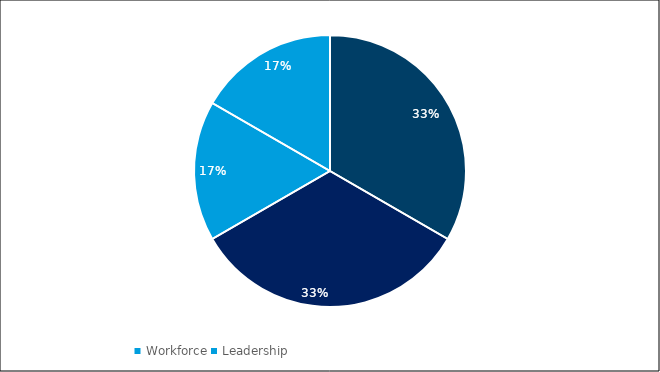
| Category | Votes for "What Focus Area stood out as most important?" |
|---|---|
| Resources | 2 |
| Community Alliances* | 2 |
| Workforce | 1 |
| Leadership | 1 |